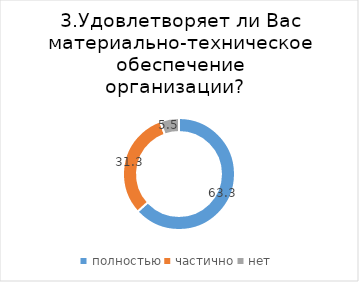
| Category | Series 0 |
|---|---|
| полностью | 63.275 |
| частично | 31.259 |
| нет | 5.466 |